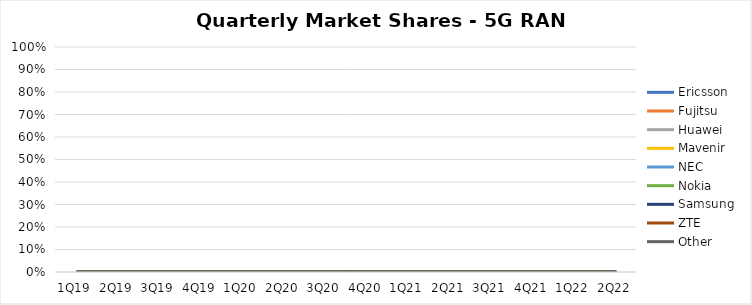
| Category | Ericsson | Fujitsu | Huawei | Mavenir | NEC | Nokia | Samsung | ZTE | Other |
|---|---|---|---|---|---|---|---|---|---|
| 1Q19 | 0 | 0 | 0 | 0 | 0 | 0 | 0 | 0 | 0 |
| 2Q19 | 0 | 0 | 0 | 0 | 0 | 0 | 0 | 0 | 0 |
| 3Q19 | 0 | 0 | 0 | 0 | 0 | 0 | 0 | 0 | 0 |
| 4Q19 | 0 | 0 | 0 | 0 | 0 | 0 | 0 | 0 | 0 |
| 1Q20 | 0 | 0 | 0 | 0 | 0 | 0 | 0 | 0 | 0 |
| 2Q20 | 0 | 0 | 0 | 0 | 0 | 0 | 0 | 0 | 0 |
| 3Q20 | 0 | 0 | 0 | 0 | 0 | 0 | 0 | 0 | 0 |
| 4Q20 | 0 | 0 | 0 | 0 | 0 | 0 | 0 | 0 | 0 |
| 1Q21 | 0 | 0 | 0 | 0 | 0 | 0 | 0 | 0 | 0 |
| 2Q21 | 0 | 0 | 0 | 0 | 0 | 0 | 0 | 0 | 0 |
| 3Q21 | 0 | 0 | 0 | 0 | 0 | 0 | 0 | 0 | 0 |
| 4Q21 | 0 | 0 | 0 | 0 | 0 | 0 | 0 | 0 | 0 |
| 1Q22 | 0 | 0 | 0 | 0 | 0 | 0 | 0 | 0 | 0 |
| 2Q22 | 0 | 0 | 0 | 0 | 0 | 0 | 0 | 0 | 0 |